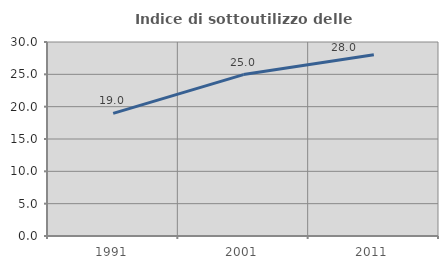
| Category | Indice di sottoutilizzo delle abitazioni  |
|---|---|
| 1991.0 | 18.97 |
| 2001.0 | 24.959 |
| 2011.0 | 28.035 |